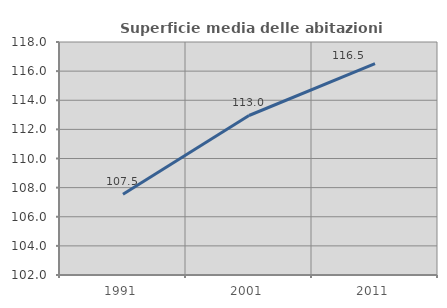
| Category | Superficie media delle abitazioni occupate |
|---|---|
| 1991.0 | 107.55 |
| 2001.0 | 112.953 |
| 2011.0 | 116.521 |